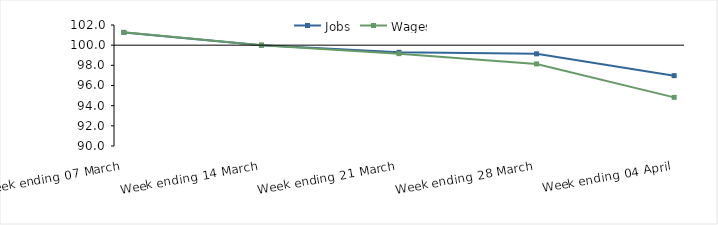
| Category | Jobs | Wages |
|---|---|---|
| 0 | 101.263 | 101.272 |
| 1900-01-01 | 100 | 100 |
| 1900-01-02 | 99.289 | 99.159 |
| 1900-01-03 | 99.139 | 98.139 |
| 1900-01-04 | 96.976 | 94.825 |